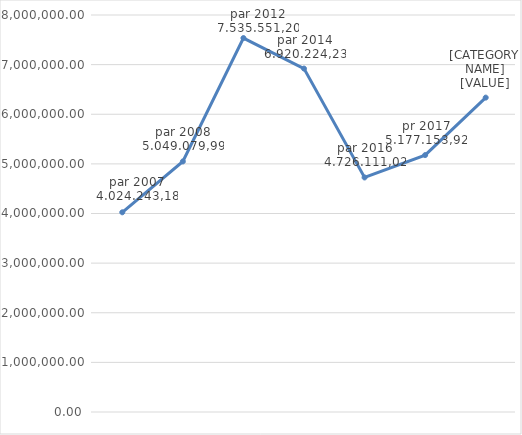
| Category | Iznos EUR |
|---|---|
| par 2007 | 4024243.179 |
| par 2008 | 5049079.987 |
| par 2012 | 7535551.197 |
| par 2014 | 6920224.235 |
| par 2016 | 4726111.021 |
| pr 2017 | 5177153.921 |
| par 2020 | 6335334.535 |